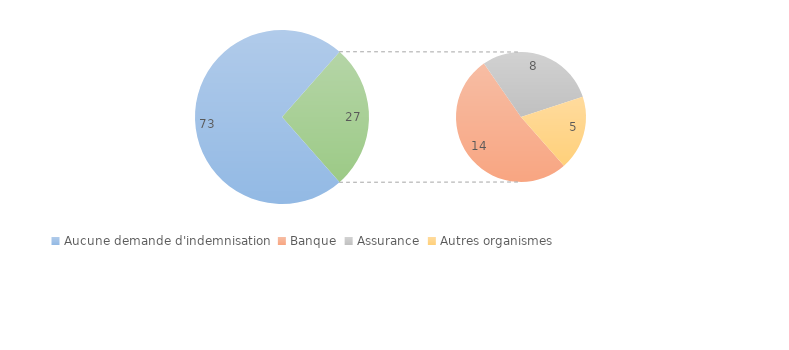
| Category | Series 0 |
|---|---|
| Aucune demande d'indemnisation | 73 |
| Banque | 14 |
| Assurance | 8 |
| Autres organismes | 5 |